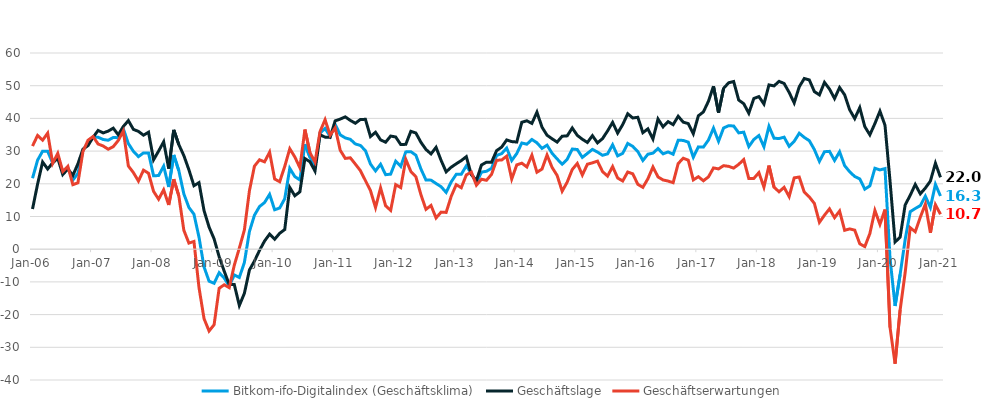
| Category | Bitkom-ifo-Digitalindex (Geschäftsklima) | Geschäftslage | Geschäftserwartungen |
|---|---|---|---|
| 2006-01-01 | 21.7 | 12.29 | 31.54 |
| 2006-02-01 | 27.21 | 19.88 | 34.79 |
| 2006-03-01 | 29.98 | 26.67 | 33.34 |
| 2006-04-01 | 29.94 | 24.52 | 35.49 |
| 2006-05-01 | 26.33 | 26.41 | 26.26 |
| 2006-06-01 | 28.57 | 27.83 | 29.31 |
| 2006-07-01 | 23.3 | 22.83 | 23.78 |
| 2006-08-01 | 24.94 | 24.52 | 25.35 |
| 2006-09-01 | 21.15 | 22.57 | 19.73 |
| 2006-10-01 | 23.19 | 26.12 | 20.3 |
| 2006-11-01 | 30.24 | 30.6 | 29.89 |
| 2006-12-01 | 32.51 | 31.68 | 33.33 |
| 2007-01-01 | 34.33 | 34.22 | 34.45 |
| 2007-02-01 | 34.24 | 36.32 | 32.17 |
| 2007-03-01 | 33.55 | 35.56 | 31.57 |
| 2007-04-01 | 33.32 | 36.11 | 30.57 |
| 2007-05-01 | 34.16 | 37.01 | 31.35 |
| 2007-06-01 | 34.1 | 34.96 | 33.25 |
| 2007-07-01 | 36.84 | 37.53 | 36.15 |
| 2007-08-01 | 32.29 | 39.33 | 25.45 |
| 2007-09-01 | 29.94 | 36.64 | 23.43 |
| 2007-10-01 | 28.31 | 36.03 | 20.83 |
| 2007-11-01 | 29.45 | 34.86 | 24.17 |
| 2007-12-01 | 29.42 | 35.78 | 23.23 |
| 2008-01-01 | 22.45 | 27.34 | 17.67 |
| 2008-02-01 | 22.53 | 30.02 | 15.29 |
| 2008-03-01 | 25.39 | 32.85 | 18.17 |
| 2008-04-01 | 19.01 | 24.64 | 13.53 |
| 2008-05-01 | 28.83 | 36.5 | 21.41 |
| 2008-06-01 | 24.03 | 31.99 | 16.34 |
| 2008-07-01 | 16.91 | 28.63 | 5.79 |
| 2008-08-01 | 12.78 | 24.29 | 1.86 |
| 2008-09-01 | 10.72 | 19.41 | 2.37 |
| 2008-10-01 | 3.7 | 20.35 | -11.69 |
| 2008-11-01 | -5.41 | 11.82 | -21.23 |
| 2008-12-01 | -9.78 | 6.78 | -25.02 |
| 2009-01-01 | -10.42 | 3.15 | -23.09 |
| 2009-02-01 | -7.19 | -2.31 | -11.95 |
| 2009-03-01 | -8.81 | -6.72 | -10.88 |
| 2009-04-01 | -11.28 | -10.8 | -11.76 |
| 2009-05-01 | -7.87 | -10.8 | -4.9 |
| 2009-06-01 | -8.65 | -17.22 | 0.33 |
| 2009-07-01 | -4.05 | -13.5 | 5.87 |
| 2009-08-01 | 5.4 | -6.37 | 17.88 |
| 2009-09-01 | 10.4 | -3.6 | 25.41 |
| 2009-10-01 | 13.04 | -0.37 | 27.34 |
| 2009-11-01 | 14.27 | 2.5 | 26.71 |
| 2009-12-01 | 16.77 | 4.6 | 29.67 |
| 2010-01-01 | 12.06 | 3.04 | 21.47 |
| 2010-02-01 | 12.6 | 4.86 | 20.63 |
| 2010-03-01 | 15.44 | 6.01 | 25.31 |
| 2010-04-01 | 24.72 | 18.88 | 30.72 |
| 2010-05-01 | 22.2 | 16.35 | 28.21 |
| 2010-06-01 | 21.19 | 17.53 | 24.92 |
| 2010-07-01 | 32.11 | 27.72 | 36.59 |
| 2010-08-01 | 28.14 | 26.74 | 29.55 |
| 2010-09-01 | 25.26 | 23.9 | 26.62 |
| 2010-10-01 | 35.5 | 35 | 36 |
| 2010-11-01 | 36.92 | 34.27 | 39.6 |
| 2010-12-01 | 34.51 | 34.19 | 34.84 |
| 2011-01-01 | 38.18 | 39.25 | 37.12 |
| 2011-02-01 | 34.98 | 39.79 | 30.26 |
| 2011-03-01 | 34.03 | 40.47 | 27.77 |
| 2011-04-01 | 33.6 | 39.39 | 27.95 |
| 2011-05-01 | 32.19 | 38.52 | 26.02 |
| 2011-06-01 | 31.72 | 39.68 | 24.03 |
| 2011-07-01 | 30.15 | 39.71 | 20.97 |
| 2011-08-01 | 26.03 | 34.45 | 17.9 |
| 2011-09-01 | 23.95 | 35.76 | 12.74 |
| 2011-10-01 | 25.98 | 33.43 | 18.76 |
| 2011-11-01 | 22.79 | 32.72 | 13.28 |
| 2011-12-01 | 22.95 | 34.61 | 11.87 |
| 2012-01-01 | 26.92 | 34.31 | 19.75 |
| 2012-02-01 | 25.33 | 32.01 | 18.84 |
| 2012-03-01 | 29.76 | 32.07 | 27.48 |
| 2012-04-01 | 29.83 | 36.04 | 23.77 |
| 2012-05-01 | 28.74 | 35.53 | 22.15 |
| 2012-06-01 | 24.53 | 32.69 | 16.66 |
| 2012-07-01 | 21.16 | 30.5 | 12.19 |
| 2012-08-01 | 21.12 | 29.14 | 13.38 |
| 2012-09-01 | 20.09 | 31.16 | 9.55 |
| 2012-10-01 | 19.11 | 27.16 | 11.34 |
| 2012-11-01 | 17.37 | 23.66 | 11.25 |
| 2012-12-01 | 20.57 | 25.07 | 16.15 |
| 2013-01-01 | 22.9 | 26.12 | 19.73 |
| 2013-02-01 | 22.91 | 27.1 | 18.8 |
| 2013-03-01 | 25.49 | 28.29 | 22.72 |
| 2013-04-01 | 23.18 | 22.79 | 23.57 |
| 2013-05-01 | 20.28 | 20.98 | 19.58 |
| 2013-06-01 | 23.57 | 25.75 | 21.4 |
| 2013-07-01 | 23.83 | 26.62 | 21.07 |
| 2013-08-01 | 24.74 | 26.61 | 22.89 |
| 2013-09-01 | 28.67 | 30.14 | 27.21 |
| 2013-10-01 | 29.23 | 31.22 | 27.27 |
| 2013-11-01 | 30.92 | 33.41 | 28.45 |
| 2013-12-01 | 27.11 | 32.91 | 21.46 |
| 2014-01-01 | 29.26 | 32.77 | 25.79 |
| 2014-02-01 | 32.48 | 38.82 | 26.31 |
| 2014-03-01 | 32.11 | 39.27 | 25.16 |
| 2014-04-01 | 33.56 | 38.48 | 28.75 |
| 2014-05-01 | 32.54 | 41.91 | 23.54 |
| 2014-06-01 | 30.83 | 37.33 | 24.5 |
| 2014-07-01 | 31.81 | 34.86 | 28.8 |
| 2014-08-01 | 29.34 | 33.76 | 25.01 |
| 2014-09-01 | 27.6 | 32.75 | 22.56 |
| 2014-10-01 | 25.99 | 34.55 | 17.74 |
| 2014-11-01 | 27.48 | 34.66 | 20.51 |
| 2014-12-01 | 30.64 | 37.08 | 24.37 |
| 2015-01-01 | 30.48 | 34.81 | 26.23 |
| 2015-02-01 | 28.08 | 33.62 | 22.68 |
| 2015-03-01 | 29.29 | 32.64 | 25.99 |
| 2015-04-01 | 30.52 | 34.71 | 26.41 |
| 2015-05-01 | 29.71 | 32.52 | 26.93 |
| 2015-06-01 | 28.72 | 33.81 | 23.74 |
| 2015-07-01 | 29.15 | 36.16 | 22.35 |
| 2015-08-01 | 31.93 | 38.78 | 25.27 |
| 2015-09-01 | 28.53 | 35.5 | 21.77 |
| 2015-10-01 | 29.31 | 38.09 | 20.86 |
| 2015-11-01 | 32.34 | 41.42 | 23.6 |
| 2015-12-01 | 31.44 | 40.13 | 23.05 |
| 2016-01-01 | 29.86 | 40.34 | 19.84 |
| 2016-02-01 | 27.13 | 35.64 | 18.92 |
| 2016-03-01 | 29.05 | 36.81 | 21.54 |
| 2016-04-01 | 29.37 | 33.68 | 25.14 |
| 2016-05-01 | 30.79 | 39.81 | 22.1 |
| 2016-06-01 | 29.16 | 37.42 | 21.18 |
| 2016-07-01 | 29.75 | 39.01 | 20.84 |
| 2016-08-01 | 29.04 | 38.09 | 20.34 |
| 2016-09-01 | 33.31 | 40.66 | 26.19 |
| 2016-10-01 | 33.27 | 38.85 | 27.82 |
| 2016-11-01 | 32.75 | 38.41 | 27.23 |
| 2016-12-01 | 28.14 | 35.32 | 21.19 |
| 2017-01-01 | 31.29 | 40.79 | 22.17 |
| 2017-02-01 | 31.22 | 41.98 | 20.93 |
| 2017-03-01 | 33.39 | 45.24 | 22.11 |
| 2017-04-01 | 37.02 | 49.85 | 24.85 |
| 2017-05-01 | 33 | 41.75 | 24.56 |
| 2017-06-01 | 37.07 | 49.19 | 25.55 |
| 2017-07-01 | 37.77 | 50.89 | 25.33 |
| 2017-08-01 | 37.68 | 51.28 | 24.81 |
| 2017-09-01 | 35.58 | 45.61 | 25.95 |
| 2017-10-01 | 35.79 | 44.49 | 27.41 |
| 2017-11-01 | 31.38 | 41.59 | 21.61 |
| 2017-12-01 | 33.55 | 46.09 | 21.65 |
| 2018-01-01 | 34.76 | 46.67 | 23.42 |
| 2018-02-01 | 31.33 | 44.39 | 18.97 |
| 2018-03-01 | 37.59 | 50.24 | 25.58 |
| 2018-04-01 | 33.94 | 49.94 | 18.96 |
| 2018-05-01 | 33.84 | 51.33 | 17.56 |
| 2018-06-01 | 34.26 | 50.68 | 18.92 |
| 2018-07-01 | 31.46 | 47.94 | 16.08 |
| 2018-08-01 | 33 | 44.74 | 21.82 |
| 2018-09-01 | 35.46 | 49.66 | 22.07 |
| 2018-10-01 | 34.19 | 52.2 | 17.46 |
| 2018-11-01 | 33.18 | 51.76 | 15.98 |
| 2018-12-01 | 30.46 | 48.2 | 13.99 |
| 2019-01-01 | 26.86 | 47.18 | 8.22 |
| 2019-02-01 | 29.81 | 51.02 | 10.4 |
| 2019-03-01 | 29.92 | 48.97 | 12.34 |
| 2019-04-01 | 27.13 | 46.08 | 9.65 |
| 2019-05-01 | 29.79 | 49.45 | 11.67 |
| 2019-06-01 | 25.55 | 47.22 | 5.78 |
| 2019-07-01 | 23.68 | 42.62 | 6.21 |
| 2019-08-01 | 22.23 | 39.95 | 5.83 |
| 2019-09-01 | 21.5 | 43.29 | 1.66 |
| 2019-10-01 | 18.36 | 37.47 | 0.79 |
| 2019-11-01 | 19.36 | 34.98 | 4.78 |
| 2019-12-01 | 24.75 | 38.43 | 11.85 |
| 2020-01-01 | 24.24 | 42.21 | 7.59 |
| 2020-02-01 | 24.65 | 37.92 | 12.12 |
| 2020-03-01 | -2.82 | 20.83 | -23.94 |
| 2020-04-01 | -17.36 | 2.2 | -35.02 |
| 2020-05-01 | -7.77 | 3.69 | -18.58 |
| 2020-06-01 | 2.94 | 13.54 | -7.14 |
| 2020-07-01 | 11.48 | 16.49 | 6.59 |
| 2020-08-01 | 12.43 | 19.79 | 5.31 |
| 2020-09-01 | 13.31 | 16.93 | 9.75 |
| 2020-10-01 | 16.22 | 18.69 | 13.78 |
| 2020-11-01 | 12.77 | 20.84 | 5 |
| 2020-12-01 | 19.84 | 26.3 | 13.58 |
| 2021-01-01 | 16.26 | 21.98 | 10.68 |